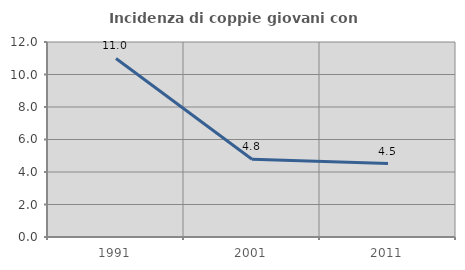
| Category | Incidenza di coppie giovani con figli |
|---|---|
| 1991.0 | 10.989 |
| 2001.0 | 4.783 |
| 2011.0 | 4.52 |